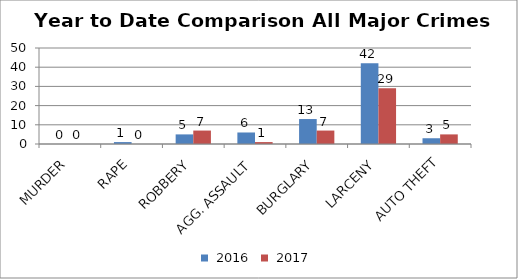
| Category | 2016 | 2017 |
|---|---|---|
| MURDER | 0 | 0 |
| RAPE | 1 | 0 |
| ROBBERY | 5 | 7 |
| AGG. ASSAULT | 6 | 1 |
| BURGLARY | 13 | 7 |
| LARCENY | 42 | 29 |
| AUTO THEFT | 3 | 5 |